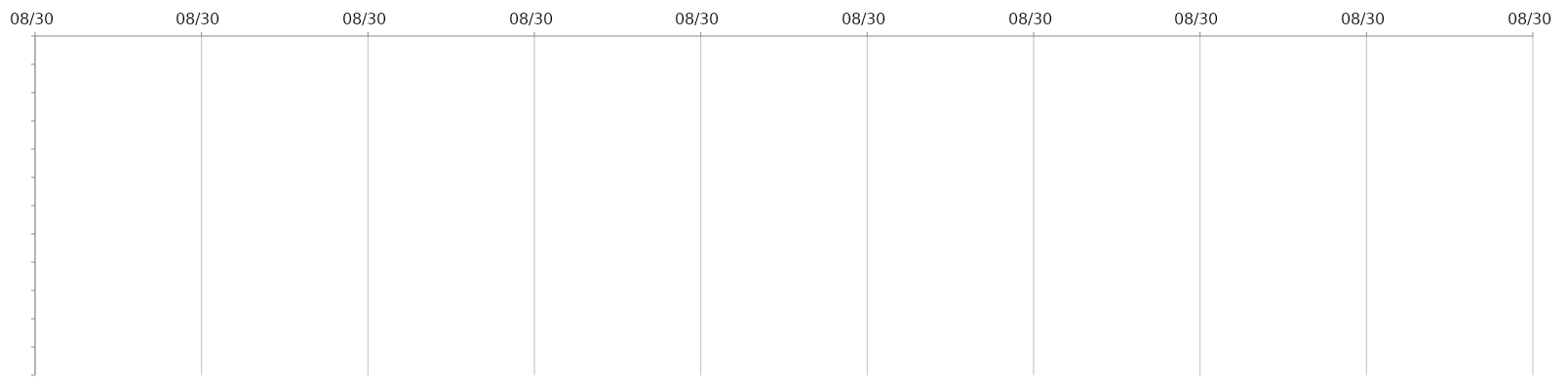
| Category | INIZIO | GIORNI |
|---|---|---|
|  |  | 0 |
|  |  | 0 |
|  |  | 0 |
|  |  | 0 |
|  |  | 0 |
|  |  | 0 |
|  |  | 0 |
|  |  | 0 |
|  |  | 0 |
|  |  | 0 |
|  |  | 0 |
|  |  | 0 |